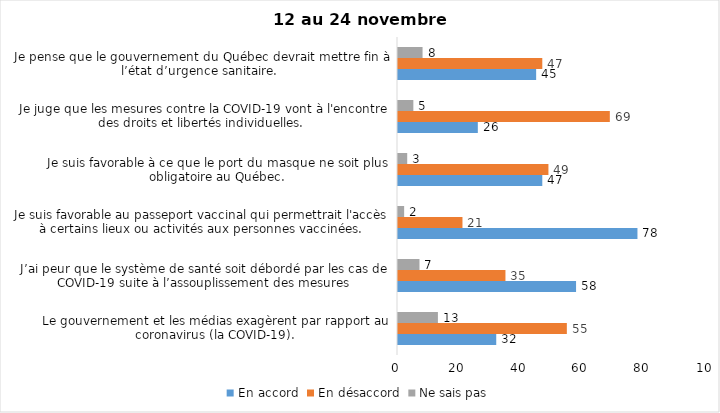
| Category | En accord | En désaccord | Ne sais pas |
|---|---|---|---|
| Le gouvernement et les médias exagèrent par rapport au coronavirus (la COVID-19). | 32 | 55 | 13 |
| J’ai peur que le système de santé soit débordé par les cas de COVID-19 suite à l’assouplissement des mesures | 58 | 35 | 7 |
| Je suis favorable au passeport vaccinal qui permettrait l'accès à certains lieux ou activités aux personnes vaccinées. | 78 | 21 | 2 |
| Je suis favorable à ce que le port du masque ne soit plus obligatoire au Québec. | 47 | 49 | 3 |
| Je juge que les mesures contre la COVID-19 vont à l'encontre des droits et libertés individuelles.  | 26 | 69 | 5 |
| Je pense que le gouvernement du Québec devrait mettre fin à l’état d’urgence sanitaire.  | 45 | 47 | 8 |